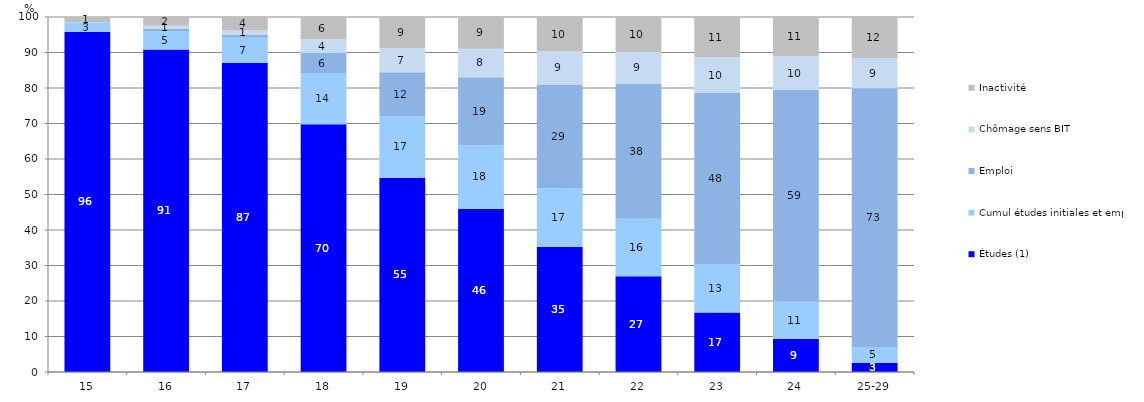
| Category | Études (1) | Cumul études initiales et emploi | Emploi | Chômage sens BIT | Inactivité  |
|---|---|---|---|---|---|
| 15 | 95.79 | 2.56 | 0.2 | 0.02 | 1.42 |
| 16 | 90.82 | 5.26 | 0.64 | 0.84 | 2.45 |
| 17 | 87.05 | 7.09 | 0.78 | 1.28 | 3.81 |
| 18 | 69.78 | 14.42 | 5.67 | 3.88 | 6.26 |
| 19 | 54.75 | 17.37 | 12.33 | 6.72 | 8.84 |
| 20 | 46.02 | 17.86 | 19.15 | 8.06 | 8.91 |
| 21 | 35.29 | 16.5 | 29.23 | 9.34 | 9.65 |
| 22 | 27 | 16.14 | 38.1 | 8.91 | 9.85 |
| 23 | 16.77 | 13.48 | 48.32 | 10.1 | 11.33 |
| 24 | 9.35 | 10.57 | 59.49 | 9.63 | 10.97 |
| 25-29 | 2.54 | 4.51 | 72.85 | 8.55 | 11.55 |